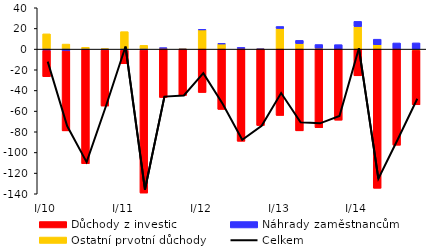
| Category | Ostatní prvotní důchody | Náhrady zaměstnancům | Důchody z investic |
|---|---|---|---|
| I/10 | 14.773 | -1.446 | -25.236 |
| II | 4.877 | -1.972 | -77.154 |
| III | 1.775 | -0.726 | -110.19 |
| IV | 0.471 | -1.005 | -54.098 |
| I/11 | 16.905 | -1.179 | -13.01 |
| II | 3.673 | -0.898 | -138.45 |
| III | 0.917 | 0.182 | -46.828 |
| IV | 0.201 | -0.359 | -44.5 |
| I/12 | 18.684 | 0.227 | -41.994 |
| II | 5.046 | 0.336 | -58.363 |
| III | 0.625 | 1.034 | -89.224 |
| IV | 0.042 | -0.116 | -73.825 |
| I/13 | 19.989 | 1.936 | -64.207 |
| II | 5.367 | 3.108 | -79.099 |
| III | 0.9 | 3.539 | -76.077 |
| IV | -0.021 | 4.321 | -68.775 |
| I/14 | 21.825 | 5.021 | -25.838 |
| II | 4.194 | 5.405 | -134.69 |
| III | 0.166 | 5.79 | -92.96 |
| IV | -1.284 | 6.025 | -52.617 |